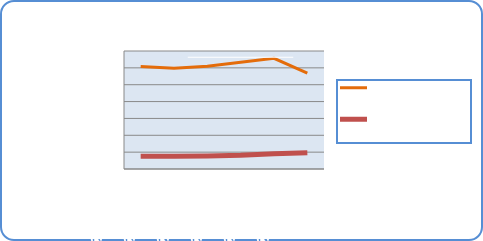
| Category | Motorin Türleri  | Benzin Türleri |
|---|---|---|
| 4/2/18 | 60832458.087 | 7507024.985 |
| 4/3/18 | 59773980.948 | 7582934.36 |
| 4/4/18 | 60898743.303 | 7769817.12 |
| 4/5/18 | 63313383.665 | 8140882.241 |
| 4/6/18 | 65634880.561 | 9027310.1 |
| 4/7/18 | 56811728.762 | 9709958.956 |